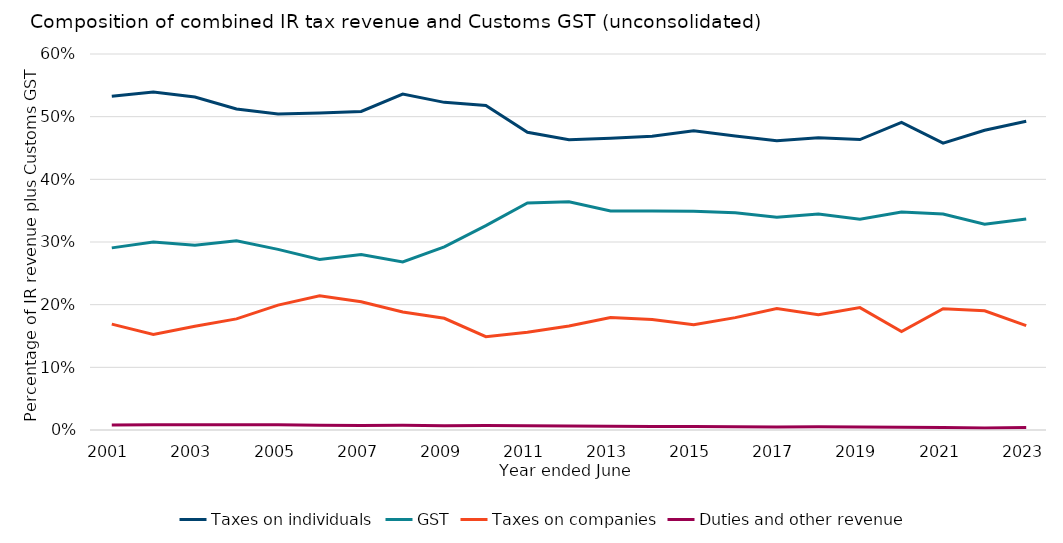
| Category | Taxes on individuals | GST | Taxes on companies | Duties and other revenue |
|---|---|---|---|---|
| 2001.0 | 0.533 | 0.291 | 0.169 | 0.008 |
| 2002.0 | 0.539 | 0.3 | 0.152 | 0.009 |
| 2003.0 | 0.531 | 0.295 | 0.165 | 0.008 |
| 2004.0 | 0.512 | 0.302 | 0.177 | 0.008 |
| 2005.0 | 0.504 | 0.288 | 0.199 | 0.008 |
| 2006.0 | 0.506 | 0.272 | 0.214 | 0.008 |
| 2007.0 | 0.508 | 0.28 | 0.205 | 0.007 |
| 2008.0 | 0.536 | 0.268 | 0.188 | 0.007 |
| 2009.0 | 0.523 | 0.292 | 0.178 | 0.007 |
| 2010.0 | 0.518 | 0.326 | 0.149 | 0.007 |
| 2011.0 | 0.475 | 0.362 | 0.156 | 0.007 |
| 2012.0 | 0.463 | 0.364 | 0.166 | 0.006 |
| 2013.0 | 0.465 | 0.349 | 0.179 | 0.006 |
| 2014.0 | 0.469 | 0.349 | 0.176 | 0.006 |
| 2015.0 | 0.477 | 0.349 | 0.168 | 0.005 |
| 2016.0 | 0.469 | 0.347 | 0.179 | 0.005 |
| 2017.0 | 0.461 | 0.34 | 0.194 | 0.005 |
| 2018.0 | 0.466 | 0.345 | 0.184 | 0.005 |
| 2019.0 | 0.464 | 0.336 | 0.195 | 0.005 |
| 2020.0 | 0.491 | 0.348 | 0.157 | 0.004 |
| 2021.0 | 0.458 | 0.345 | 0.194 | 0.004 |
| 2022.0 | 0.478 | 0.328 | 0.19 | 0.003 |
| 2023.0 | 0.493 | 0.337 | 0.167 | 0.004 |